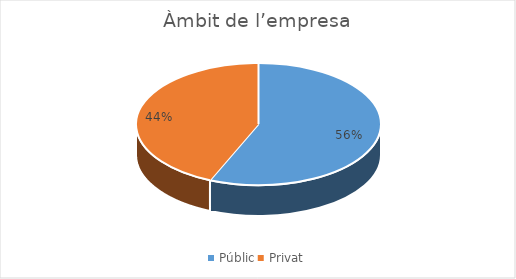
| Category | Series 0 |
|---|---|
| Públic | 61 |
| Privat | 47 |